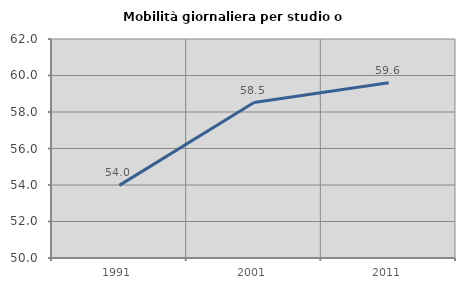
| Category | Mobilità giornaliera per studio o lavoro |
|---|---|
| 1991.0 | 53.98 |
| 2001.0 | 58.519 |
| 2011.0 | 59.605 |